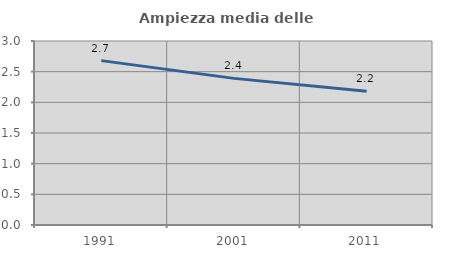
| Category | Ampiezza media delle famiglie |
|---|---|
| 1991.0 | 2.68 |
| 2001.0 | 2.391 |
| 2011.0 | 2.181 |